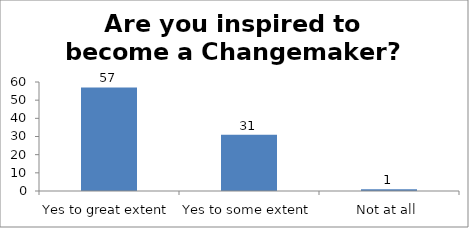
| Category | Are you inspired to become a Changemaker?   |
|---|---|
| Yes to great extent | 57 |
| Yes to some extent | 31 |
| Not at all | 1 |